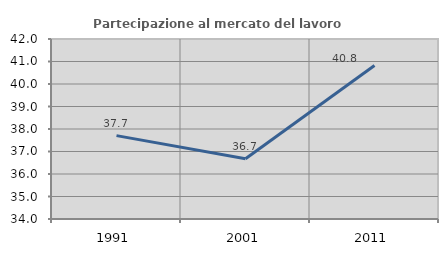
| Category | Partecipazione al mercato del lavoro  femminile |
|---|---|
| 1991.0 | 37.706 |
| 2001.0 | 36.681 |
| 2011.0 | 40.822 |